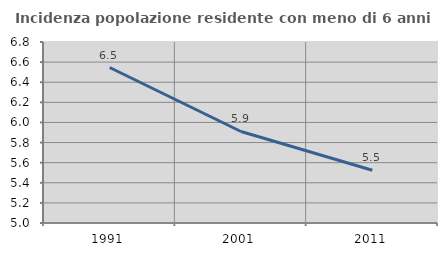
| Category | Incidenza popolazione residente con meno di 6 anni |
|---|---|
| 1991.0 | 6.546 |
| 2001.0 | 5.91 |
| 2011.0 | 5.525 |